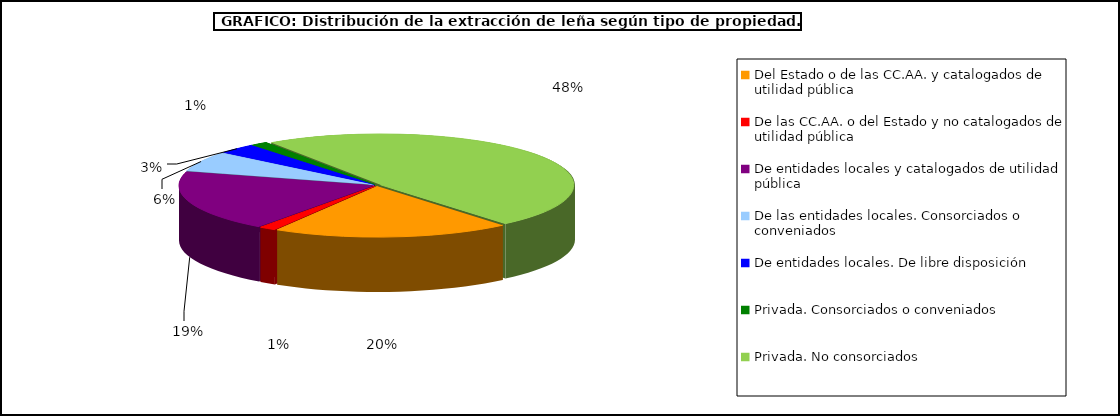
| Category | Series 0 |
|---|---|
| Del Estado o de las CC.AA. y catalogados de utilidad pública | 285976.557 |
| De las CC.AA. o del Estado y no catalogados de utilidad pública | 20364.729 |
| De entidades locales y catalogados de utilidad pública | 280786.675 |
| De las entidades locales. Consorciados o conveniados | 93882.029 |
| De entidades locales. De libre disposición | 47628.738 |
| Privada. Consorciados o conveniados | 20343.27 |
| Privada. No consorciados | 701081.683 |